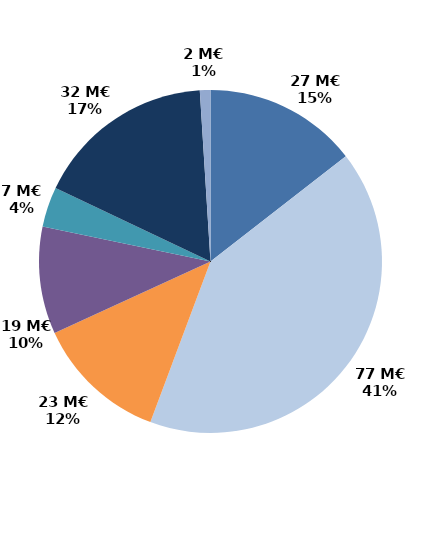
| Category | Series 0 |
|---|---|
| Accueil et information (CEP 1) | 26.912 |
| Accompagnement renforcé (CEP 2 et 3) | 76.68 |
| Suivi | 23.165 |
| Missions locales | 18.813 |
| CSP | 7.03 |
| Aide à la création d'entreprise | 31.521 |
| Aide à l'insertion | 1.854 |